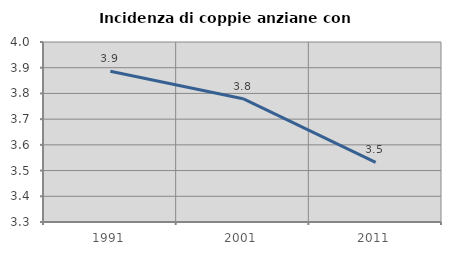
| Category | Incidenza di coppie anziane con figli |
|---|---|
| 1991.0 | 3.886 |
| 2001.0 | 3.78 |
| 2011.0 | 3.532 |